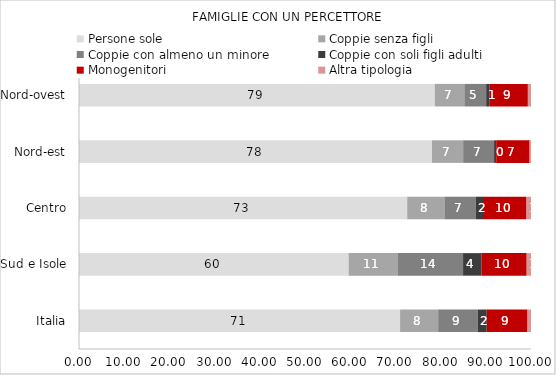
| Category | Persone sole | Coppie senza figli | Coppie con almeno un minore | Coppie con soli figli adulti | Monogenitori | Altra tipologia |
|---|---|---|---|---|---|---|
| Italia | 71.04 | 8.42 | 8.79 | 1.96 | 9.02 | 0.77 |
| Sud e Isole | 59.65 | 10.91 | 14.41 | 4.11 | 9.97 | 0.95 |
| Centro | 72.61 | 8.36 | 6.84 | 1.57 | 9.63 | 0.99 |
| Nord-est | 78.1 | 6.89 | 6.84 | 0.47 | 7.39 | 0.3 |
| Nord-ovest | 78.71 | 6.54 | 4.83 | 0.69 | 8.54 | 0.69 |